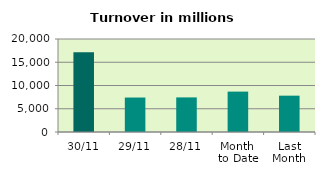
| Category | Series 0 |
|---|---|
| 30/11 | 17146.844 |
| 29/11 | 7411.038 |
| 28/11 | 7440.662 |
| Month 
to Date | 8686.894 |
| Last
Month | 7813.06 |